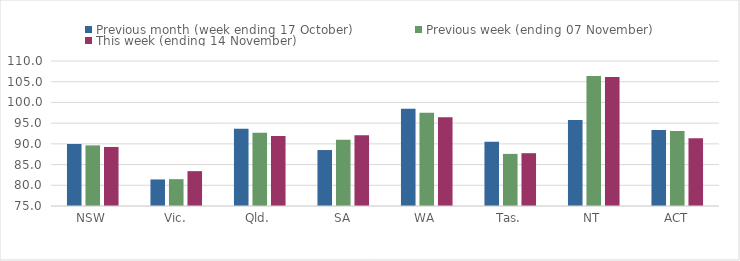
| Category | Previous month (week ending 17 October) | Previous week (ending 07 November) | This week (ending 14 November) |
|---|---|---|---|
| NSW | 89.97 | 89.63 | 89.25 |
| Vic. | 81.41 | 81.48 | 83.41 |
| Qld. | 93.64 | 92.67 | 91.88 |
| SA | 88.51 | 91.02 | 92.06 |
| WA | 98.48 | 97.52 | 96.45 |
| Tas. | 90.53 | 87.58 | 87.75 |
| NT | 95.73 | 106.35 | 106.14 |
| ACT | 93.36 | 93.1 | 91.38 |